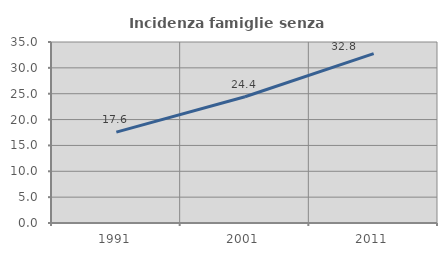
| Category | Incidenza famiglie senza nuclei |
|---|---|
| 1991.0 | 17.566 |
| 2001.0 | 24.407 |
| 2011.0 | 32.761 |